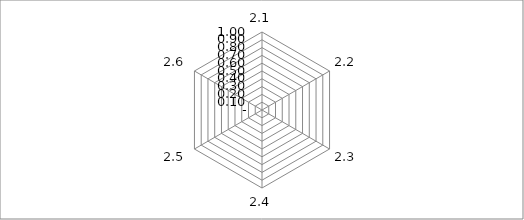
| Category | Series 0 |
|---|---|
| 2.1 | 0 |
| 2.2 | 0 |
| 2.3 | 0 |
| 2.4 | 0 |
| 2.5 | 0 |
| 2.6 | 0 |